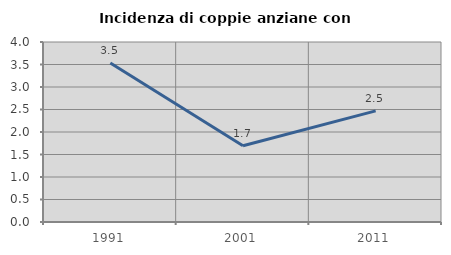
| Category | Incidenza di coppie anziane con figli |
|---|---|
| 1991.0 | 3.535 |
| 2001.0 | 1.695 |
| 2011.0 | 2.469 |